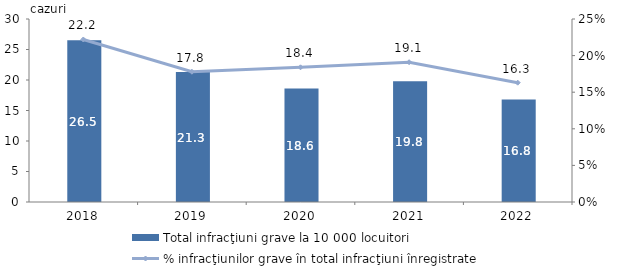
| Category | Total infracţiuni grave la 10 000 locuitori  |
|---|---|
| 2018.0 | 26.5 |
| 2019.0 | 21.3 |
| 2020.0 | 18.6 |
| 2021.0 | 19.8 |
| 2022.0 | 16.8 |